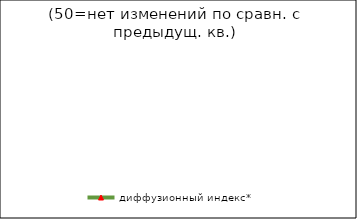
| Category | диффузионный индекс* |
|---|---|
| 2008-1 | 51.725 |
| 2008-2 | 50.48 |
| 2008-3 | 51.275 |
| 2008-4 | 49.67 |
| 2009-1 болжам | 49.395 |